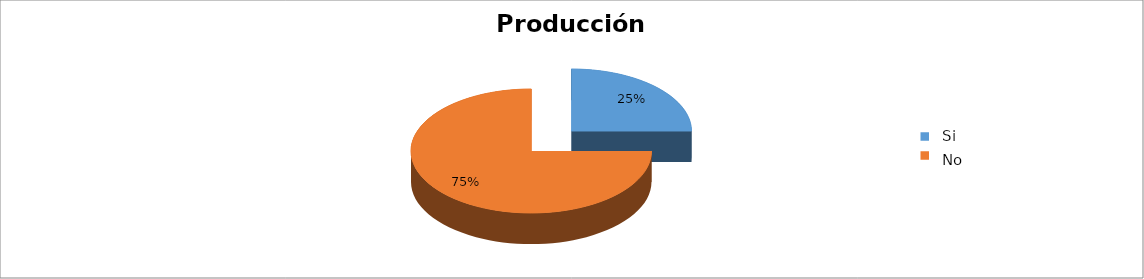
| Category | Porcentaje |
|---|---|
| 0 | 0.25 |
| 1 | 0.75 |